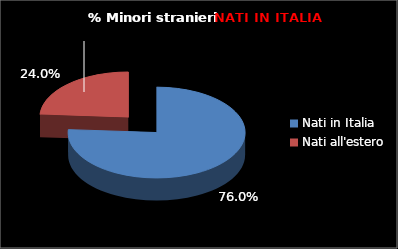
| Category | Series 0 |
|---|---|
| Nati in Italia | 149 |
| Nati all'estero | 47 |